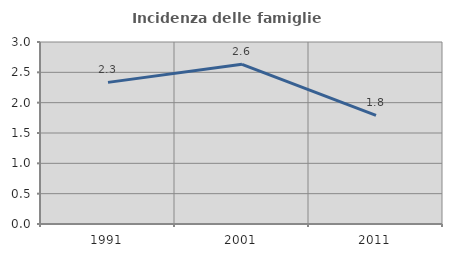
| Category | Incidenza delle famiglie numerose |
|---|---|
| 1991.0 | 2.335 |
| 2001.0 | 2.632 |
| 2011.0 | 1.79 |